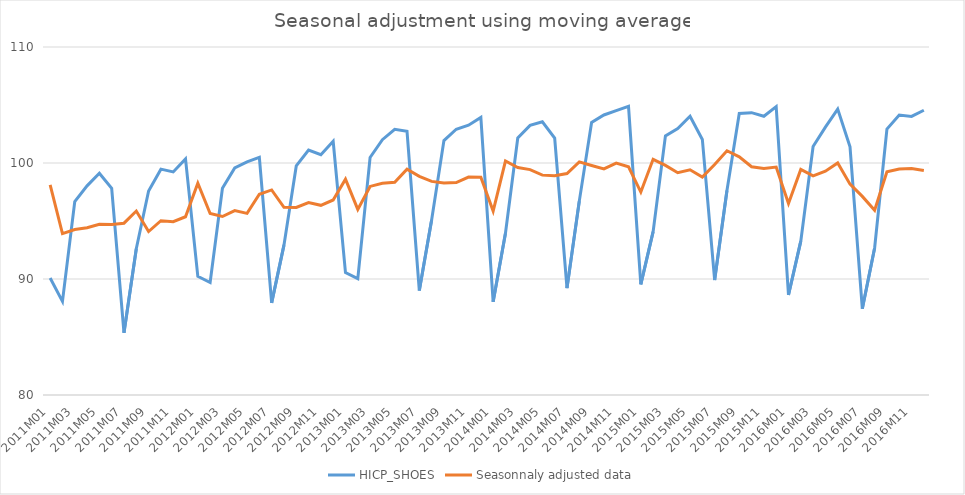
| Category | HICP_SHOES | Seasonnaly adjusted data |
|---|---|---|
| 2011M01 | 90.09 | 98.105 |
| 2011M02 | 88.07 | 93.911 |
| 2011M03 | 96.67 | 94.266 |
| 2011M04 | 98.03 | 94.414 |
| 2011M05 | 99.12 | 94.721 |
| 2011M06 | 97.81 | 94.707 |
| 2011M07 | 85.36 | 94.811 |
| 2011M08 | 92.61 | 95.858 |
| 2011M09 | 97.59 | 94.091 |
| 2011M10 | 99.47 | 95.024 |
| 2011M11 | 99.23 | 94.936 |
| 2011M12 | 100.35 | 95.367 |
| 2012M01 | 90.23 | 98.257 |
| 2012M02 | 89.7 | 95.649 |
| 2012M03 | 97.82 | 95.387 |
| 2012M04 | 99.57 | 95.897 |
| 2012M05 | 100.1 | 95.657 |
| 2012M06 | 100.49 | 97.302 |
| 2012M07 | 87.94 | 97.677 |
| 2012M08 | 92.92 | 96.179 |
| 2012M09 | 99.75 | 96.174 |
| 2012M10 | 101.11 | 96.591 |
| 2012M11 | 100.71 | 96.352 |
| 2012M12 | 101.87 | 96.812 |
| 2013M01 | 90.55 | 98.606 |
| 2013M02 | 90.03 | 96.001 |
| 2013M03 | 100.48 | 97.981 |
| 2013M04 | 102.01 | 98.247 |
| 2013M05 | 102.9 | 98.333 |
| 2013M06 | 102.73 | 99.471 |
| 2013M07 | 89 | 98.854 |
| 2013M08 | 95.08 | 98.415 |
| 2013M09 | 101.93 | 98.276 |
| 2013M10 | 102.91 | 98.311 |
| 2013M11 | 103.26 | 98.792 |
| 2013M12 | 103.93 | 98.77 |
| 2014M01 | 88.03 | 95.861 |
| 2014M02 | 93.94 | 100.17 |
| 2014M03 | 102.15 | 99.61 |
| 2014M04 | 103.24 | 99.431 |
| 2014M05 | 103.55 | 98.954 |
| 2014M06 | 102.15 | 98.91 |
| 2014M07 | 89.21 | 99.088 |
| 2014M08 | 96.71 | 100.102 |
| 2014M09 | 103.5 | 99.789 |
| 2014M10 | 104.14 | 99.486 |
| 2014M11 | 104.52 | 99.997 |
| 2014M12 | 104.88 | 99.672 |
| 2015M01 | 89.53 | 97.495 |
| 2015M02 | 94.08 | 100.32 |
| 2015M03 | 102.34 | 99.795 |
| 2015M04 | 102.96 | 99.162 |
| 2015M05 | 104.03 | 99.413 |
| 2015M06 | 102.03 | 98.793 |
| 2015M07 | 89.91 | 99.865 |
| 2015M08 | 97.63 | 101.055 |
| 2015M09 | 104.27 | 100.532 |
| 2015M10 | 104.34 | 99.677 |
| 2015M11 | 104.03 | 99.528 |
| 2015M12 | 104.86 | 99.653 |
| 2016M01 | 88.62 | 96.504 |
| 2016M02 | 93.26 | 99.445 |
| 2016M03 | 101.42 | 98.898 |
| 2016M04 | 103.09 | 99.287 |
| 2016M05 | 104.65 | 100.005 |
| 2016M06 | 101.39 | 98.174 |
| 2016M07 | 87.44 | 97.122 |
| 2016M08 | 92.67 | 95.921 |
| 2016M09 | 102.93 | 99.24 |
| 2016M10 | 104.14 | 99.486 |
| 2016M11 | 104.02 | 99.519 |
| 2016M12 | 104.55 | 99.359 |